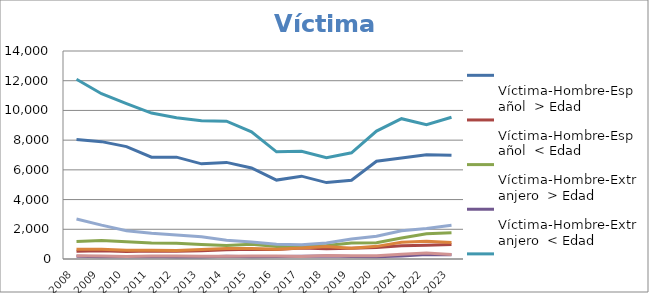
| Category |   Víctima-Hombre-Español  > Edad |   Víctima-Hombre-Español  < Edad |   Víctima-Hombre-Extranjero  > Edad |   Víctima-Hombre-Extranjero  < Edad |   Víctima-Mujer-Española  > Edad |   Víctima-Mujer-Española  < Edad |   Víctima-Mujer-Extranjera > Edad |   Víctima-Mujer-Extranjera <  Edad |
|---|---|---|---|---|---|---|---|---|
| 2008.0 | 8051 | 522 | 1183 | 177 | 12096 | 660 | 2694 | 224 |
| 2009.0 | 7899 | 563 | 1244 | 153 | 11126 | 659 | 2278 | 206 |
| 2010.0 | 7562 | 513 | 1155 | 149 | 10461 | 589 | 1907 | 176 |
| 2011.0 | 6849 | 534 | 1070 | 170 | 9821 | 582 | 1729 | 207 |
| 2012.0 | 6856 | 517 | 1054 | 141 | 9503 | 571 | 1617 | 209 |
| 2013.0 | 6406 | 555 | 984 | 133 | 9312 | 645 | 1492 | 189 |
| 2014.0 | 6502 | 628 | 914 | 187 | 9277 | 707 | 1266 | 180 |
| 2015.0 | 6129 | 659 | 998 | 152 | 8562 | 703 | 1149 | 195 |
| 2016.0 | 5312 | 643 | 847 | 175 | 7214 | 658 | 996 | 203 |
| 2017.0 | 5575 | 740 | 857 | 188 | 7257 | 737 | 966 | 176 |
| 2018.0 | 5142 | 688 | 913 | 205 | 6825 | 845 | 1082 | 232 |
| 2019.0 | 5297 | 731 | 1071 | 176 | 7146 | 731 | 1344 | 216 |
| 2020.0 | 6581 | 772 | 1096 | 151 | 8608 | 851 | 1533 | 224 |
| 2021.0 | 6795 | 894 | 1410 | 208 | 9445 | 1122 | 1903 | 313 |
| 2022.0 | 7018 | 933 | 1695 | 305 | 9044 | 1202 | 2057 | 399 |
| 2023.0 | 6975 | 972 | 1764 | 292 | 9544 | 1111 | 2271 | 298 |